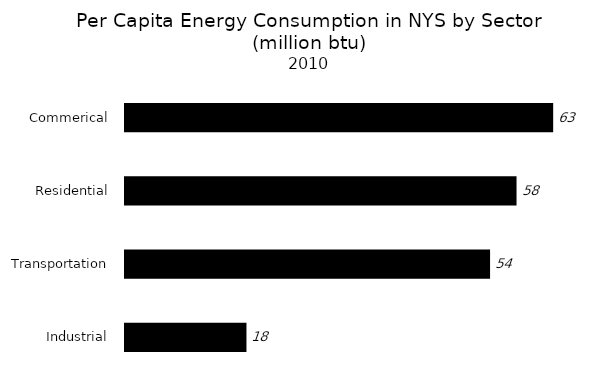
| Category | New York State |
|---|---|
| Industrial | 17.9 |
| Transportation | 53.8 |
| Residential | 57.7 |
| Commerical | 63.1 |